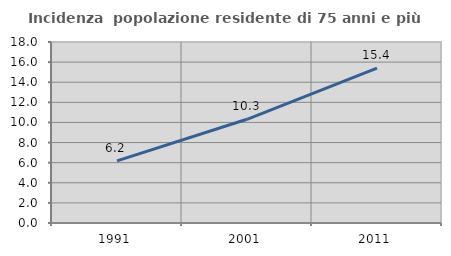
| Category | Incidenza  popolazione residente di 75 anni e più |
|---|---|
| 1991.0 | 6.176 |
| 2001.0 | 10.314 |
| 2011.0 | 15.402 |